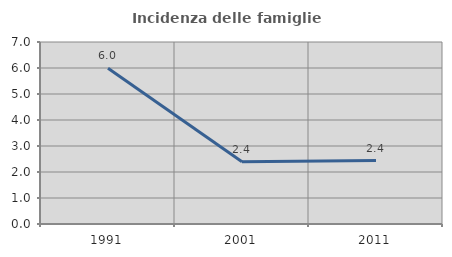
| Category | Incidenza delle famiglie numerose |
|---|---|
| 1991.0 | 5.994 |
| 2001.0 | 2.397 |
| 2011.0 | 2.439 |